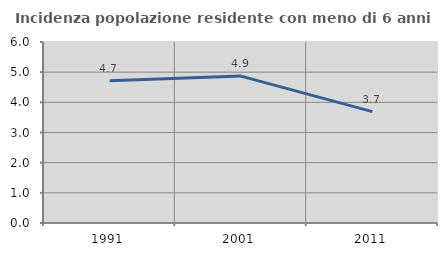
| Category | Incidenza popolazione residente con meno di 6 anni |
|---|---|
| 1991.0 | 4.715 |
| 2001.0 | 4.87 |
| 2011.0 | 3.692 |